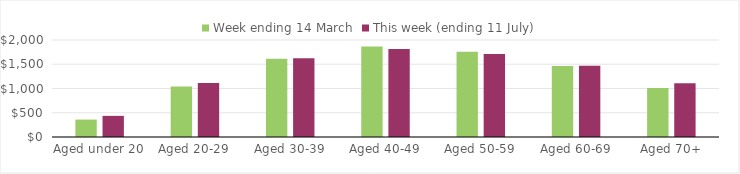
| Category | Week ending 14 March | This week (ending 11 July) |
|---|---|---|
| Aged under 20 | 359.29 | 435.96 |
| Aged 20-29 | 1038.7 | 1114.4 |
| Aged 30-39 | 1615.69 | 1623 |
| Aged 40-49 | 1866.84 | 1813.91 |
| Aged 50-59 | 1759.24 | 1712.93 |
| Aged 60-69 | 1462.71 | 1467.46 |
| Aged 70+ | 1012.77 | 1107.24 |